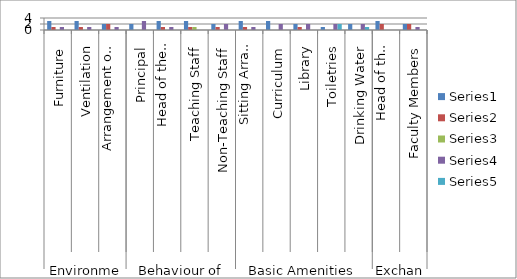
| Category | Series 0 | Series 1 | Series 2 | Series 3 | Series 4 |
|---|---|---|---|---|---|
| 0 | 3 | 1 | 0 | 1 | 0 |
| 1 | 3 | 1 | 0 | 1 | 0 |
| 2 | 2 | 2 | 0 | 1 | 0 |
| 3 | 2 | 0 | 0 | 3 | 0 |
| 4 | 3 | 1 | 0 | 1 | 0 |
| 5 | 3 | 1 | 1 | 0 | 0 |
| 6 | 2 | 1 | 0 | 2 | 0 |
| 7 | 3 | 1 | 0 | 1 | 0 |
| 8 | 3 | 0 | 0 | 2 | 0 |
| 9 | 2 | 1 | 0 | 2 | 0 |
| 10 | 1 | 0 | 0 | 2 | 2 |
| 11 | 2 | 0 | 0 | 2 | 1 |
| 12 | 3 | 2 | 0 | 0 | 0 |
| 13 | 2 | 2 | 0 | 1 | 0 |